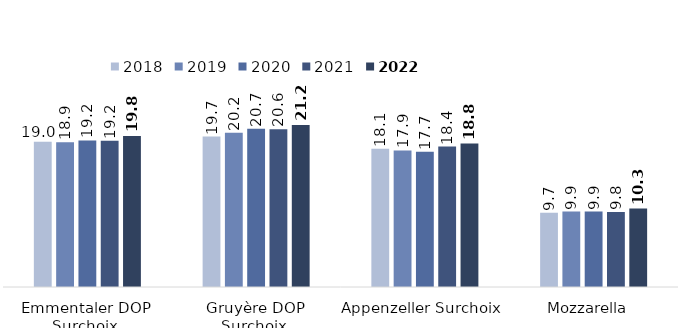
| Category | 2018 | 2019 | 2020 | 2021 | 2022 |
|---|---|---|---|---|---|
| Emmentaler DOP Surchoix  | 19.027 | 18.94 | 19.186 | 19.151 | 19.768 |
| Gruyère DOP Surchoix  | 19.684 | 20.175 | 20.727 | 20.644 | 21.198 |
| Appenzeller Surchoix  | 18.08 | 17.874 | 17.714 | 18.375 | 18.768 |
| Mozzarella  | 9.727 | 9.869 | 9.874 | 9.814 | 10.267 |